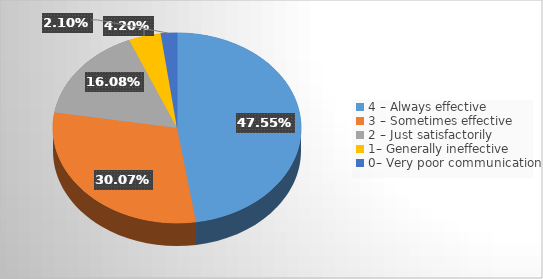
| Category | Series 0 |
|---|---|
| 4 – Always effective  | 0.476 |
| 3 – Sometimes effective   | 0.301 |
| 2 – Just satisfactorily  | 0.161 |
| 1– Generally ineffective  | 0.042 |
| 0– Very poor communication | 0.021 |